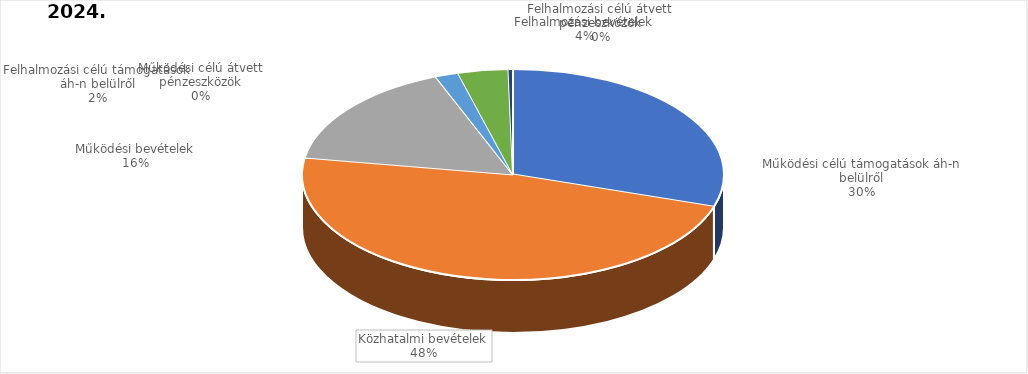
| Category | 2024. év | 2020. év |
|---|---|---|
| Működési célú támogatások áh-n belülről | 13472764000 | 7384765000 |
| Közhatalmi bevételek | 21427610000 | 14559920000 |
| Működési bevételek | 7403976000 | 6892862000 |
| Működési célú átvett pénzeszközök | 2000000 | 117000000 |
| Felhalmozási célú támogatások áh-n belülről | 800000000 | 819994000 |
| Felhalmozási bevételek | 1737200000 | 1138796000 |
| Felhalmozási célú átvett pénzeszközök | 154304000 | 9000000 |